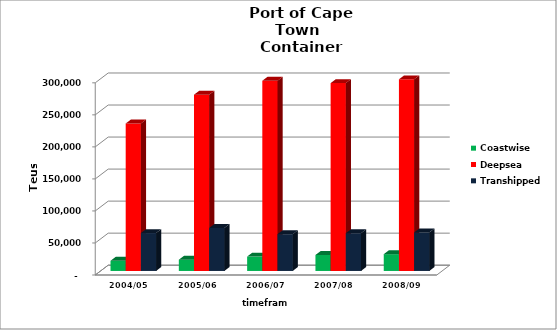
| Category | Coastwise | Deepsea | Transhipped |
|---|---|---|---|
| 2004/05 | 15913 | 230239 | 59169 |
| 2005/06 | 17563 | 275176 | 67128 |
| 2006/07 | 22479 | 296936 | 57431 |
| 2007/08 | 24916 | 293237 | 58893 |
| 2008/09 | 26216 | 299156 | 60132 |